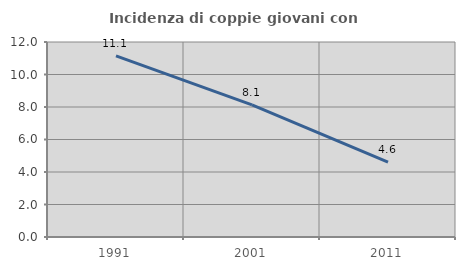
| Category | Incidenza di coppie giovani con figli |
|---|---|
| 1991.0 | 11.148 |
| 2001.0 | 8.136 |
| 2011.0 | 4.61 |